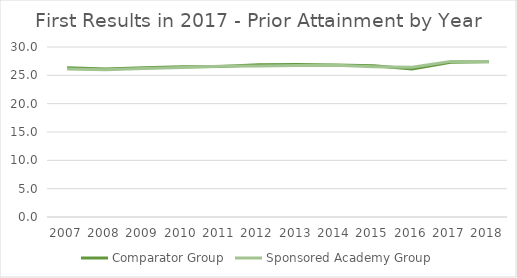
| Category | Comparator Group | Sponsored Academy Group |
|---|---|---|
| 2007.0 | 26.335 | 26.109 |
| 2008.0 | 26.133 | 26 |
| 2009.0 | 26.345 | 26.219 |
| 2010.0 | 26.493 | 26.385 |
| 2011.0 | 26.573 | 26.599 |
| 2012.0 | 26.856 | 26.653 |
| 2013.0 | 26.915 | 26.743 |
| 2014.0 | 26.837 | 26.762 |
| 2015.0 | 26.705 | 26.536 |
| 2016.0 | 26.116 | 26.431 |
| 2017.0 | 27.31 | 27.462 |
| 2018.0 | 27.418 | 27.451 |